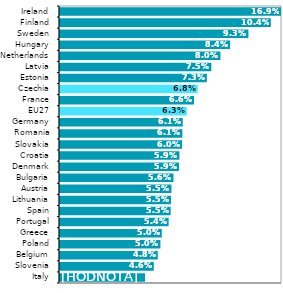
| Category | Series 0 |
|---|---|
| Italy | 0.042 |
| Slovenia | 0.046 |
| Belgium | 0.048 |
| Poland | 0.05 |
| Greece | 0.05 |
| Portugal | 0.054 |
| Spain | 0.055 |
| Lithuania | 0.055 |
| Austria | 0.055 |
| Bulgaria | 0.056 |
| Denmark | 0.059 |
| Croatia | 0.059 |
| Slovakia | 0.06 |
| Romania | 0.061 |
| Germany | 0.061 |
| EU27 | 0.063 |
| France | 0.066 |
| Czechia | 0.068 |
| Estonia | 0.073 |
| Latvia | 0.075 |
| Netherlands | 0.08 |
| Hungary | 0.084 |
| Sweden | 0.093 |
| Finland | 0.104 |
| Ireland | 0.169 |